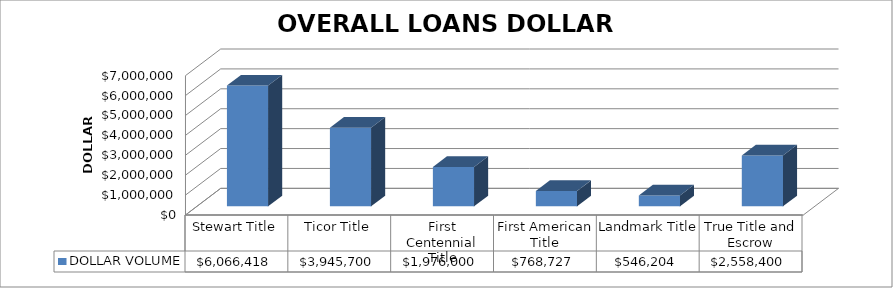
| Category | DOLLAR VOLUME |
|---|---|
| Stewart Title | 6066417.58 |
| Ticor Title | 3945700 |
| First Centennial Title | 1976000 |
| First American Title | 768727 |
| Landmark Title | 546204 |
| True Title and Escrow | 2558400 |